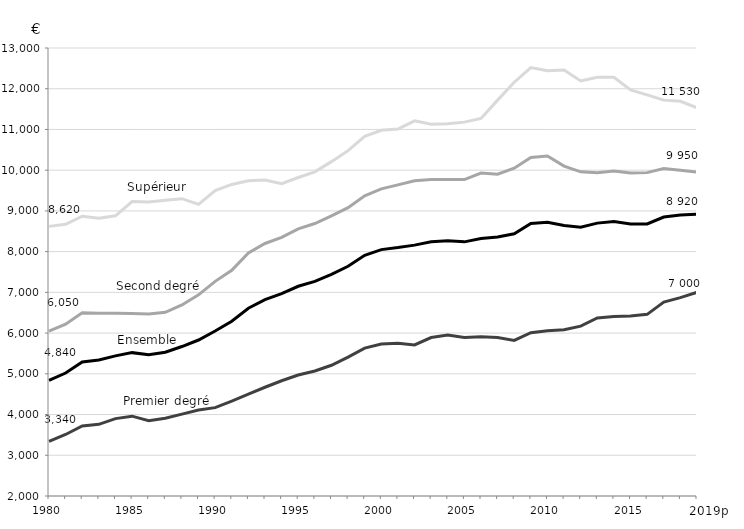
| Category | Premier degré | Second degré | Supérieur | Ensemble |
|---|---|---|---|---|
| 1980 | 3340 | 6050 | 8620 | 4840 |
| 1981 | 3510 | 6220 | 8670 | 5020 |
| 1982 | 3720 | 6500 | 8870 | 5290 |
| 1983 | 3760 | 6490 | 8820 | 5340 |
| 1984 | 3900 | 6490 | 8880 | 5440 |
| 1985 | 3960 | 6480 | 9230 | 5520 |
| 1986 | 3850 | 6470 | 9220 | 5470 |
| 1987 | 3910 | 6510 | 9260 | 5530 |
| 1988 | 4010 | 6690 | 9300 | 5670 |
| 1989 | 4110 | 6940 | 9160 | 5830 |
| 1990 | 4170 | 7270 | 9500 | 6050 |
| 1991 | 4330 | 7540 | 9650 | 6290 |
| 1992 | 4500 | 7970 | 9740 | 6610 |
| 1993 | 4670 | 8200 | 9760 | 6820 |
| 1994 | 4830 | 8350 | 9670 | 6970 |
| 1995 | 4970 | 8560 | 9820 | 7150 |
| 1996 | 5070 | 8690 | 9960 | 7270 |
| 1997 | 5210 | 8880 | 10210 | 7440 |
| 1998 | 5410 | 9080 | 10480 | 7640 |
| 1999 | 5630 | 9370 | 10830 | 7910 |
| 2000 | 5730 | 9540 | 10980 | 8050 |
| 2001 | 5750 | 9640 | 11010 | 8100 |
| 2002 | 5710 | 9740 | 11210 | 8160 |
| 2003 | 5890 | 9770 | 11130 | 8240 |
| 2004 | 5950 | 9770 | 11140 | 8270 |
| 2005 | 5890 | 9770 | 11180 | 8240 |
| 2006 | 5910 | 9930 | 11270 | 8320 |
| 2007 | 5890 | 9900 | 11720 | 8360 |
| 2008 | 5820 | 10050 | 12160 | 8440 |
| 2009 | 6010 | 10310 | 12520 | 8690 |
| 2010 | 6060 | 10350 | 12440 | 8720 |
| 2011 | 6080 | 10100 | 12460 | 8640 |
| 2012 | 6170 | 9960 | 12190 | 8600 |
| 2013 | 6370 | 9940 | 12280 | 8700 |
| 2014 | 6410 | 9980 | 12280 | 8740 |
| 2015 | 6420 | 9930 | 11970 | 8680 |
| 2016 | 6460 | 9940 | 11850 | 8680 |
| 2017 | 6760 | 10040 | 11720 | 8850 |
| 2018 | 6870 | 10000 | 11690 | 8900 |
| 2019 (p) | 7000 | 9950 | 11530 | 8920 |